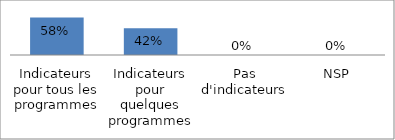
| Category | Series 0 |
|---|---|
| Indicateurs pour tous les programmes | 0.583 |
| Indicateurs pour quelques programmes | 0.417 |
| Pas d'indicateurs | 0 |
| NSP | 0 |